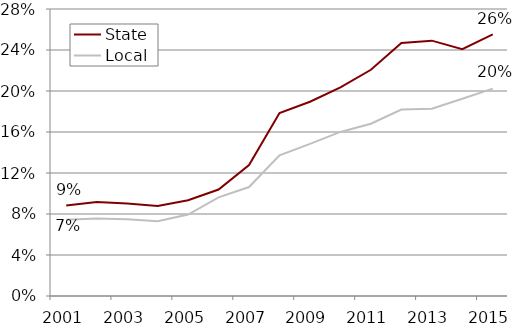
| Category | State | Local |
|---|---|---|
| 2001.0 | 0.088 | 0.074 |
| 2002.0 | 0.092 | 0.076 |
| 2003.0 | 0.09 | 0.075 |
| 2004.0 | 0.088 | 0.073 |
| 2005.0 | 0.093 | 0.079 |
| 2006.0 | 0.104 | 0.096 |
| 2007.0 | 0.128 | 0.106 |
| 2008.0 | 0.179 | 0.137 |
| 2009.0 | 0.19 | 0.148 |
| 2010.0 | 0.203 | 0.16 |
| 2011.0 | 0.221 | 0.168 |
| 2012.0 | 0.247 | 0.182 |
| 2013.0 | 0.249 | 0.183 |
| 2014.0 | 0.241 | 0.192 |
| 2015.0 | 0.255 | 0.202 |